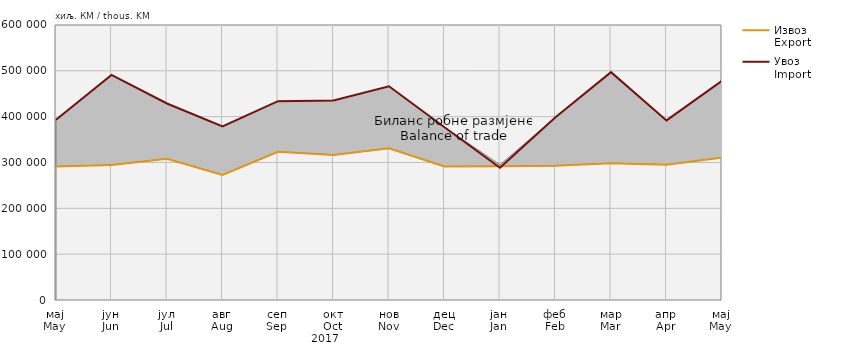
| Category | Извоз
Export | Увоз
Import |
|---|---|---|
| мај
May | 291490 | 393257 |
| јун
Jun | 294506 | 491152 |
| јул
Jul | 308275 | 428722 |
| авг
Aug | 272830 | 378735 |
| сеп
Sep | 323479 | 433731 |
| окт
Oct | 316474 | 435293 |
| нов
Nov | 330900 | 466301 |
| дец
Dec | 291210 | 376925 |
| јан
Jan | 291772 | 288441 |
| феб
Feb | 292931 | 398865 |
| мар
Mar | 298528 | 497089 |
| апр
Apr | 295277 | 391869 |
| мај
May | 310848 | 478300 |